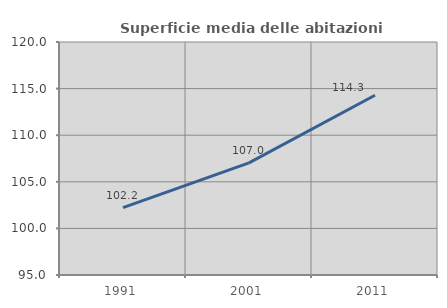
| Category | Superficie media delle abitazioni occupate |
|---|---|
| 1991.0 | 102.221 |
| 2001.0 | 107.025 |
| 2011.0 | 114.29 |